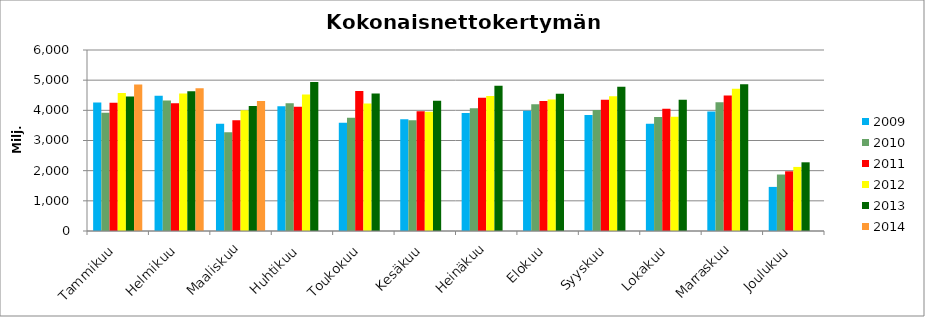
| Category | 2009 | 2010 | 2011 | 2012 | 2013 | 2014 |
|---|---|---|---|---|---|---|
| Tammikuu | 4262.104 | 3920.596 | 4254.457 | 4574.273 | 4458.574 | 4859.611 |
| Helmikuu | 4482.61 | 4324.273 | 4236.531 | 4556.683 | 4631.184 | 4733.214 |
| Maaliskuu | 3551.222 | 3273.1 | 3667.911 | 4003.705 | 4141.995 | 4307.275 |
| Huhtikuu | 4137.11 | 4235.283 | 4118.677 | 4521.853 | 4938.018 | 0 |
| Toukokuu | 3589.232 | 3758.246 | 4645.002 | 4229.781 | 4554.199 | 0 |
| Kesäkuu | 3701.617 | 3667.134 | 3966.073 | 3950.962 | 4320.908 | 0 |
| Heinäkuu | 3908.058 | 4070.751 | 4417.867 | 4473.488 | 4813.288 | 0 |
| Elokuu | 3983.999 | 4202.024 | 4310.334 | 4361.243 | 4548.338 | 0 |
| Syyskuu | 3843.197 | 4009.059 | 4353.55 | 4465.954 | 4780.078 | 0 |
| Lokakuu | 3558.554 | 3781.91 | 4052.329 | 3783.435 | 4353.533 | 0 |
| Marraskuu | 3964.456 | 4269.91 | 4491.275 | 4716.744 | 4864.184 | 0 |
| Joulukuu | 1461.632 | 1872.231 | 1978.993 | 2124.114 | 2277.179 | 0 |